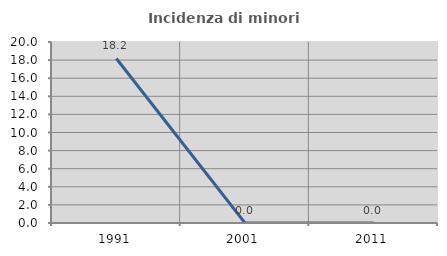
| Category | Incidenza di minori stranieri |
|---|---|
| 1991.0 | 18.182 |
| 2001.0 | 0 |
| 2011.0 | 0 |